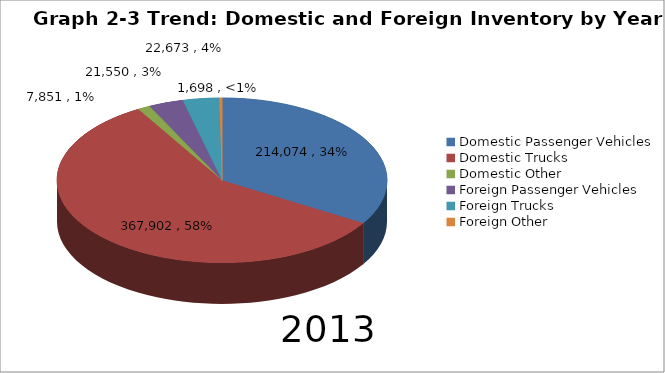
| Category | Series 0 |
|---|---|
| Domestic Passenger Vehicles | 214074 |
| Domestic Trucks | 367902 |
| Domestic Other | 7851 |
| Foreign Passenger Vehicles | 21550 |
| Foreign Trucks | 22673 |
| Foreign Other | 1698 |